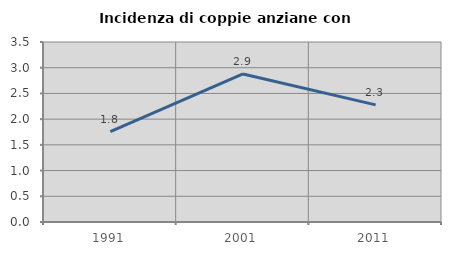
| Category | Incidenza di coppie anziane con figli |
|---|---|
| 1991.0 | 1.758 |
| 2001.0 | 2.879 |
| 2011.0 | 2.278 |